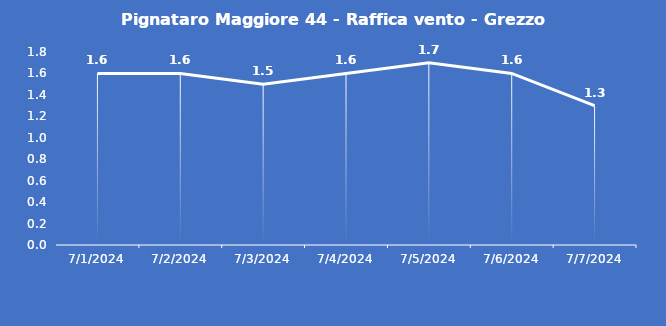
| Category | Pignataro Maggiore 44 - Raffica vento - Grezzo (m/s) |
|---|---|
| 7/1/24 | 1.6 |
| 7/2/24 | 1.6 |
| 7/3/24 | 1.5 |
| 7/4/24 | 1.6 |
| 7/5/24 | 1.7 |
| 7/6/24 | 1.6 |
| 7/7/24 | 1.3 |